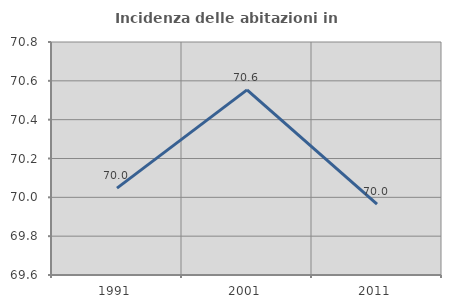
| Category | Incidenza delle abitazioni in proprietà  |
|---|---|
| 1991.0 | 70.047 |
| 2001.0 | 70.553 |
| 2011.0 | 69.965 |